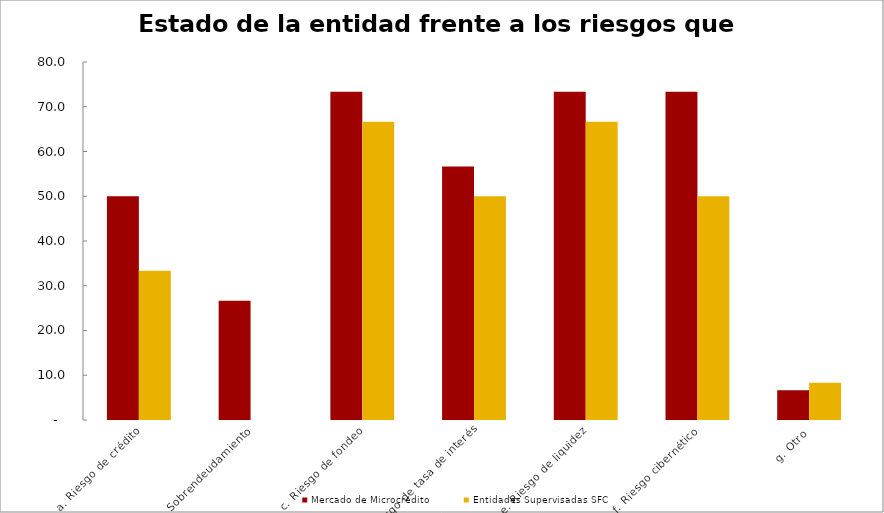
| Category | Mercado de Microcrédito | Entidades Supervisadas SFC |
|---|---|---|
| a. Riesgo de crédito | 50 | 33.333 |
| b. Sobrendeudamiento | 26.667 | 0 |
| c. Riesgo de fondeo | 73.333 | 66.667 |
| d. Riesgo de tasa de interés | 56.667 | 50 |
| e. Riesgo de liquidez | 73.333 | 66.667 |
| f. Riesgo cibernético | 73.333 | 50 |
| g. Otro | 6.667 | 8.333 |